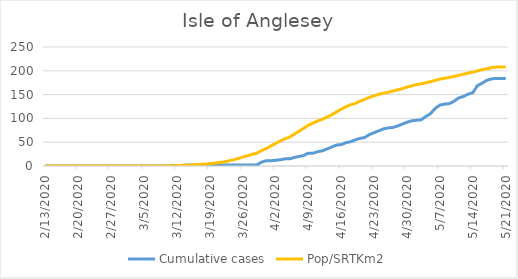
| Category | Cumulative cases | Pop/SRTKm2 |
|---|---|---|
| 5/21/20 | 184 | 207.864 |
| 5/20/20 | 184 | 207.864 |
| 5/19/20 | 184 | 207.815 |
| 5/18/20 | 183 | 206.675 |
| 5/17/20 | 180 | 204.25 |
| 5/16/20 | 174 | 202.444 |
| 5/15/20 | 169 | 199.905 |
| 5/14/20 | 154 | 197.089 |
| 5/13/20 | 151 | 195.136 |
| 5/12/20 | 146 | 192.889 |
| 5/11/20 | 143 | 190.66 |
| 5/10/20 | 136 | 187.893 |
| 5/9/20 | 131 | 186.281 |
| 5/8/20 | 130 | 184.263 |
| 5/7/20 | 128 | 182.635 |
| 5/6/20 | 121 | 179.95 |
| 5/5/20 | 110 | 177.264 |
| 5/4/20 | 104 | 174.676 |
| 5/3/20 | 97 | 172.593 |
| 5/2/20 | 96 | 171.063 |
| 5/1/20 | 95 | 168.345 |
| 4/30/20 | 92 | 165.773 |
| 4/29/20 | 88 | 162.648 |
| 4/28/20 | 84 | 159.995 |
| 4/27/20 | 81 | 157.619 |
| 4/26/20 | 80 | 154.95 |
| 4/25/20 | 78 | 153.013 |
| 4/24/20 | 74 | 150.815 |
| 4/23/20 | 70 | 147.446 |
| 4/22/20 | 66 | 144.224 |
| 4/21/20 | 60 | 140.138 |
| 4/20/20 | 58 | 136.02 |
| 4/19/20 | 55 | 131.544 |
| 4/18/20 | 51 | 128.647 |
| 4/17/20 | 49 | 124.692 |
| 4/16/20 | 45 | 119.451 |
| 4/15/20 | 44 | 113.608 |
| 4/14/20 | 40 | 107.83 |
| 4/13/20 | 36 | 102.784 |
| 4/12/20 | 32 | 98.439 |
| 4/11/20 | 30 | 94.483 |
| 4/10/20 | 27 | 90.512 |
| 4/9/20 | 27 | 85.629 |
| 4/8/20 | 22 | 79.281 |
| 4/7/20 | 20 | 73.048 |
| 4/6/20 | 18 | 66.928 |
| 4/5/20 | 15 | 60.759 |
| 4/4/20 | 15 | 57.162 |
| 4/3/20 | 13 | 52.588 |
| 4/2/20 | 12 | 47.315 |
| 4/1/20 | 11 | 41.895 |
| 3/31/20 | 11 | 36.687 |
| 3/30/20 | 8 | 32.276 |
| 3/29/20 | 2 | 26.839 |
| 3/28/20 | 2 | 24.3 |
| 3/27/20 | 2 | 21.599 |
| 3/26/20 | 2 | 18.587 |
| 3/25/20 | 2 | 15.755 |
| 3/24/20 | 2 | 12.777 |
| 3/23/20 | 2 | 10.58 |
| 3/22/20 | 2 | 8.464 |
| 3/21/20 | 2 | 7.227 |
| 3/20/20 | 2 | 6.006 |
| 3/19/20 | 2 | 4.834 |
| 3/18/20 | 2 | 3.857 |
| 3/17/20 | 2 | 3.288 |
| 3/16/20 | 2 | 2.686 |
| 3/15/20 | 2 | 2.132 |
| 3/14/20 | 2 | 1.66 |
| 3/13/20 | 1 | 1.351 |
| 3/12/20 | 1 | 0.911 |
| 3/11/20 | 1 | 0.521 |
| 3/10/20 | 0 | 0.293 |
| 3/9/20 | 0 | 0.114 |
| 3/8/20 | 0 | 0.065 |
| 3/7/20 | 0 | 0.065 |
| 3/6/20 | 0 | 0.033 |
| 3/5/20 | 0 | 0.033 |
| 3/4/20 | 0 | 0.033 |
| 3/3/20 | 0 | 0.016 |
| 3/2/20 | 0 | 0.016 |
| 3/1/20 | 0 | 0.016 |
| 2/29/20 | 0 | 0.016 |
| 2/28/20 | 0 | 0.016 |
| 2/27/20 | 0 | 0.016 |
| 2/26/20 | 0 | 0 |
| 2/25/20 | 0 | 0 |
| 2/24/20 | 0 | 0 |
| 2/23/20 | 0 | 0 |
| 2/22/20 | 0 | 0 |
| 2/21/20 | 0 | 0 |
| 2/20/20 | 0 | 0 |
| 2/19/20 | 0 | 0 |
| 2/18/20 | 0 | 0 |
| 2/17/20 | 0 | 0 |
| 2/16/20 | 0 | 0 |
| 2/15/20 | 0 | 0 |
| 2/14/20 | 0 | 0 |
| 2/13/20 | 0 | 0 |